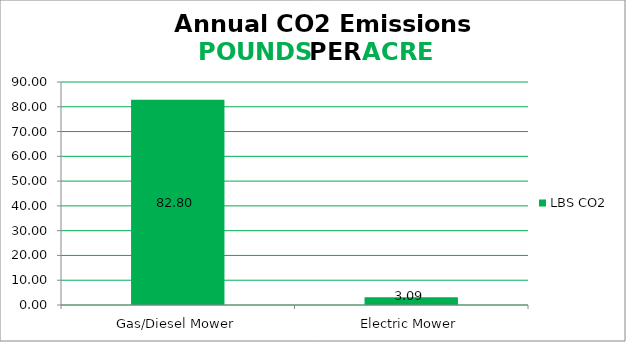
| Category | LBS CO2 |
|---|---|
| Gas/Diesel Mower | 82.8 |
| Electric Mower | 3.087 |